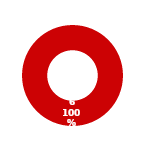
| Category | ACM |
|---|---|
| MIL 1 Complete | 0 |
| MIL 1 Not Complete | 6 |